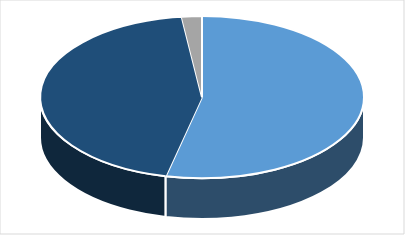
| Category | Series 0 |
|---|---|
| Hombres | 0.536 |
| Mujeres | 0.444 |
| Ns/Nr | 0.02 |